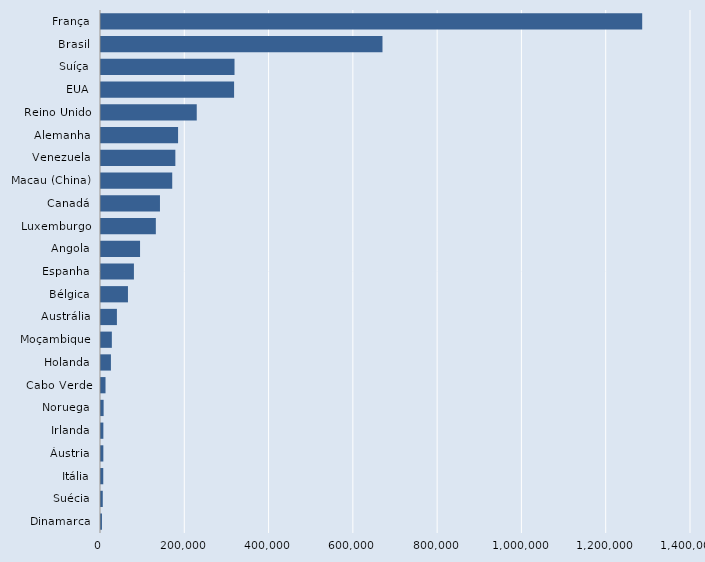
| Category | Series 0 |
|---|---|
| Dinamarca | 2261 |
| Suécia | 4205 |
| Itália | 5372 |
| Áustria | 5568 |
| Irlanda | 5602 |
| Noruega | 6200 |
| Cabo Verde | 10711 |
| Holanda | 23548 |
| Moçambique | 25739 |
| Austrália | 37755 |
| Bélgica | 63965 |
| Espanha | 78125 |
| Angola | 92666 |
| Luxemburgo | 130134 |
| Canadá | 139924 |
| Macau (China) | 169023 |
| Venezuela | 176428 |
| Alemanha | 182881 |
| Reino Unido | 227212 |
| EUA | 315808 |
| Suíça | 316832 |
| Brasil | 667928 |
| França | 1284196 |